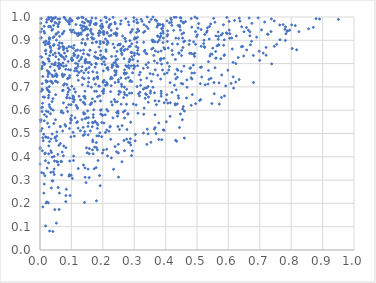
| Category | Series 0 |
|---|---|
| 0.4541369420824358 | 0.909 |
| 0.36425342668402716 | 0.811 |
| 0.018650621377337084 | 0.858 |
| 0.0783598240956136 | 0.818 |
| 0.2922729791080716 | 0.83 |
| 0.29078168796211856 | 0.79 |
| 0.0564504176763333 | 0.79 |
| 0.43031631814700655 | 0.755 |
| 0.1671409404880987 | 0.43 |
| 0.13271264775680214 | 0.827 |
| 0.040819704898491516 | 0.744 |
| 0.17581709795238964 | 0.552 |
| 0.312103027566468 | 0.587 |
| 0.1767316980024516 | 0.712 |
| 0.3323527349268639 | 0.852 |
| 0.16851155233598247 | 0.926 |
| 0.08935125592848436 | 0.695 |
| 0.4416318706145448 | 0.908 |
| 0.5812284132317448 | 0.929 |
| 0.33890889523830825 | 0.667 |
| 0.13967466178064936 | 0.76 |
| 0.07198768803036892 | 0.874 |
| 0.1455543402932431 | 0.819 |
| 0.21270084164136616 | 0.781 |
| 0.48914580625368986 | 0.893 |
| 0.4280387875943369 | 0.707 |
| 0.4047458006389789 | 0.918 |
| 0.17159628320159548 | 0.907 |
| 0.5756643256816426 | 0.821 |
| 0.19874253216855642 | 0.681 |
| 0.18305179460638032 | 0.658 |
| 0.24159906574446288 | 0.815 |
| 0.320402945626715 | 0.706 |
| 0.02074122131646161 | 0.978 |
| 0.5106205685438825 | 0.714 |
| 0.012143292039864306 | 0.891 |
| 0.0984474566373773 | 0.486 |
| 0.3447758604875678 | 0.634 |
| 0.33008943466359286 | 0.892 |
| 0.24533536410372947 | 0.852 |
| 0.06525715334072535 | 0.796 |
| 0.6151005348451926 | 0.743 |
| 0.19778845373506615 | 0.826 |
| 0.4149898250707045 | 0.632 |
| 0.27063028779467924 | 0.598 |
| 0.5353802198144602 | 0.712 |
| 0.2596065376764354 | 0.711 |
| 0.338888895276118 | 0.96 |
| 0.2910314465212448 | 0.937 |
| 0.6495799612318601 | 0.937 |
| 0.053574029154777825 | 0.489 |
| 0.3858724370550355 | 0.672 |
| 0.22816741107886374 | 0.831 |
| 0.02404067803977139 | 0.687 |
| 0.5053747462175968 | 0.972 |
| 0.23913396804368336 | 0.444 |
| 0.02721246293353108 | 0.998 |
| 0.5877486356801914 | 0.838 |
| 0.010044281454874238 | 0.657 |
| 0.11949237883693464 | 0.75 |
| 0.14152268942164326 | 0.974 |
| 0.12875278811770008 | 0.856 |
| 0.4836016601873022 | 0.759 |
| 0.21031053189299398 | 0.852 |
| 0.10618926136195761 | 0.866 |
| 0.041926912950980166 | 0.6 |
| 0.3598018179194665 | 1 |
| 0.10697274939400103 | 0.403 |
| 0.07803875219114242 | 0.845 |
| 0.9504997006804918 | 0.99 |
| 0.2882988565384922 | 0.728 |
| 0.37870212282139126 | 0.639 |
| 0.34010026515594827 | 0.842 |
| 0.061631539486543874 | 0.244 |
| 0.36233553358374215 | 0.835 |
| 0.03248012637427444 | 0.96 |
| 0.40574863017601126 | 0.803 |
| 0.21633209380656548 | 0.596 |
| 0.041054274983091 | 0.296 |
| 0.2816579293260615 | 0.741 |
| 0.6573896398284917 | 0.955 |
| 0.2938063175668243 | 0.426 |
| 0.06504099672238872 | 0.53 |
| 0.4069769954057041 | 0.63 |
| 0.3456985529301929 | 0.657 |
| 0.3760647000550975 | 0.971 |
| 0.08461552189911503 | 0.611 |
| 0.30965293640458824 | 0.843 |
| 0.05953342018716079 | 0.818 |
| 0.04476399357649252 | 0.401 |
| 0.013555992059082644 | 0.283 |
| 0.008874802842391283 | 0.806 |
| 0.41870071285473387 | 0.977 |
| 0.03466317690662324 | 0.333 |
| 0.10559863921114221 | 0.944 |
| 0.29167124145384915 | 0.405 |
| 0.22918592075789446 | 0.784 |
| 0.29889313872690504 | 0.779 |
| 0.022533577618071177 | 0.352 |
| 0.2747718021762249 | 0.759 |
| 0.48334845671236126 | 0.956 |
| 0.658199075217468 | 0.859 |
| 0.1634669312665974 | 0.698 |
| 0.006309790659640435 | 0.594 |
| 0.21064776395940066 | 0.997 |
| 0.47643352648004833 | 0.898 |
| 0.030837723719345567 | 0.614 |
| 0.3108227236191141 | 0.791 |
| 0.09386920524215847 | 0.687 |
| 0.44931941628924 | 0.983 |
| 0.2265695170696711 | 0.742 |
| 0.30889219868230056 | 0.975 |
| 0.09017447047753624 | 0.738 |
| 0.5331298404898002 | 0.954 |
| 0.2878046055647129 | 0.874 |
| 0.048170316949937564 | 0.484 |
| 0.4199437147608537 | 0.964 |
| 0.2662692950677372 | 0.654 |
| 0.14785019604814453 | 0.778 |
| 0.021013088155172555 | 0.572 |
| 0.7378631466656779 | 0.799 |
| 0.4100560462313191 | 0.772 |
| 0.0064508919697394695 | 0.521 |
| 0.03780236720581054 | 0.752 |
| 0.49498769861988523 | 0.937 |
| 0.21351042747723104 | 0.933 |
| 0.1852764950040745 | 0.823 |
| 0.07128248717239882 | 0.684 |
| 0.2856888214332125 | 0.819 |
| 0.20124431171284518 | 0.892 |
| 0.5609053205826052 | 0.824 |
| 0.005864190248920376 | 0.777 |
| 0.04195475197498022 | 0.995 |
| 0.09855438923607851 | 0.559 |
| 0.1873865830798579 | 0.704 |
| 0.27476107753262824 | 0.759 |
| 0.47641725049767003 | 0.844 |
| 0.36570761163544907 | 0.893 |
| 0.19330847875349755 | 0.583 |
| 0.6795224545742741 | 0.835 |
| 0.36686570917647154 | 0.988 |
| 0.6195148735880477 | 0.985 |
| 0.5244956043004907 | 0.869 |
| 0.007142698141979542 | 0.789 |
| 0.3763161766747162 | 0.85 |
| 0.1340034894601132 | 0.56 |
| 0.08737119556738138 | 0.854 |
| 0.2769282734567643 | 0.517 |
| 0.035990338885753204 | 0.266 |
| 0.37522888927185294 | 0.75 |
| 0.20350148362140397 | 0.827 |
| 0.04619843017007885 | 0.382 |
| 0.15406376569205482 | 0.762 |
| 0.02948032620979113 | 0.624 |
| 0.1326431372923622 | 0.952 |
| 0.1178596067890968 | 0.768 |
| 0.08625787822178443 | 0.655 |
| 0.4543546195508078 | 0.605 |
| 0.022018005345493585 | 0.989 |
| 0.5222895041005955 | 0.9 |
| 0.05080203431535568 | 0.926 |
| 0.09958617028012962 | 0.872 |
| 0.21236578380501003 | 0.432 |
| 0.05988980113013698 | 0.864 |
| 0.20851976980650921 | 0.504 |
| 0.07291981450836904 | 0.744 |
| 0.12440270616456861 | 0.66 |
| 0.09407203263259745 | 0.522 |
| 0.016730558132901474 | 0.416 |
| 0.7891567653962412 | 0.941 |
| 0.38590304090034067 | 0.66 |
| 0.1757211668190759 | 0.785 |
| 0.15223784389804185 | 0.982 |
| 0.4573507729525591 | 0.893 |
| 0.07437989823760793 | 0.404 |
| 0.19626025132430736 | 0.951 |
| 0.6947015937454893 | 0.996 |
| 0.3924862760429998 | 0.93 |
| 0.1682930876194415 | 0.765 |
| 0.10069007765472104 | 0.935 |
| 0.11927570289868539 | 0.858 |
| 0.3542473766692976 | 0.989 |
| 0.17928708943364713 | 0.461 |
| 0.1386232545259607 | 0.858 |
| 0.2841207225004484 | 0.781 |
| 0.19148609066653544 | 0.895 |
| 0.14547053902998863 | 0.948 |
| 0.15645238797563166 | 0.783 |
| 0.0032120869314473666 | 0.559 |
| 0.19678771957608887 | 0.547 |
| 0.008023046146383828 | 0.613 |
| 0.27297736309575293 | 0.993 |
| 0.37465888955938476 | 0.963 |
| 0.052160412941622436 | 0.115 |
| 0.11594989284964985 | 0.779 |
| 0.18921667651226115 | 0.941 |
| 0.17400647309308148 | 0.442 |
| 0.27093188311072924 | 0.86 |
| 0.314580168422531 | 0.839 |
| 0.35572084222226785 | 0.862 |
| 0.2266560334695189 | 0.705 |
| 0.2785425363933538 | 0.862 |
| 0.15828190726365565 | 0.805 |
| 0.24555157704604225 | 0.928 |
| 0.18124772811408185 | 0.824 |
| 0.1402829389296153 | 0.959 |
| 0.3828031824474749 | 0.967 |
| 0.5084833638727518 | 0.642 |
| 0.298863736464977 | 0.981 |
| 0.1374592727310029 | 0.492 |
| 0.28605483769843765 | 0.724 |
| 0.07673287446554033 | 0.998 |
| 0.21427684112351064 | 0.93 |
| 0.263068972043478 | 0.918 |
| 0.23267286121770692 | 0.792 |
| 0.2437506743206974 | 0.794 |
| 0.20355799827646714 | 0.89 |
| 0.3924943648783217 | 0.516 |
| 0.4425999580263531 | 0.844 |
| 0.0160308854770842 | 0.891 |
| 0.1566524486322406 | 0.311 |
| 0.04805916400474797 | 0.977 |
| 0.4084849959154375 | 0.867 |
| 0.08208455198885678 | 0.776 |
| 0.1994325435088875 | 0.96 |
| 0.5115993150903224 | 0.645 |
| 0.1870255614022176 | 0.49 |
| 0.6996893600300669 | 0.814 |
| 0.014444229824094879 | 0.8 |
| 0.5842408924470461 | 0.967 |
| 0.23781993275759594 | 0.769 |
| 0.25833157483873515 | 0.626 |
| 0.005581173460848632 | 0.827 |
| 0.0025225022676823583 | 0.973 |
| 0.021957989079289142 | 0.207 |
| 0.17786720903841025 | 0.826 |
| 0.27012285293958294 | 0.667 |
| 0.11975884592345376 | 0.608 |
| 0.10085551412692129 | 0.824 |
| 0.035564394351208506 | 0.983 |
| 0.026941532281781422 | 0.653 |
| 0.3076736115152706 | 0.989 |
| 0.35058381226790647 | 0.757 |
| 0.2366543735405674 | 0.868 |
| 0.13488703056549411 | 0.71 |
| 0.2391203070301079 | 0.719 |
| 0.05143804546716024 | 0.756 |
| 0.05230381503651105 | 0.929 |
| 0.456293890866143 | 0.978 |
| 0.7635413414886403 | 0.966 |
| 0.12426406054115047 | 0.762 |
| 0.2925383067668079 | 0.847 |
| 0.3912119711789612 | 0.94 |
| 0.05686343421882234 | 0.41 |
| 0.3451500046406737 | 0.805 |
| 0.3531314611141104 | 0.462 |
| 0.5472236785643281 | 0.629 |
| 0.04547044501751352 | 0.995 |
| 0.03558558279790902 | 0.856 |
| 0.13590593925974037 | 0.904 |
| 0.5868532986971456 | 0.902 |
| 0.24992347943655913 | 0.721 |
| 0.07100690508364638 | 0.751 |
| 0.7459459503546911 | 0.983 |
| 0.1406654270866099 | 0.735 |
| 0.0041274205002707065 | 0.911 |
| 0.38708877336909175 | 0.95 |
| 0.42224443377735366 | 0.838 |
| 0.28493127984924504 | 0.673 |
| 0.042661418663393125 | 0.335 |
| 0.38228024089360724 | 0.912 |
| 0.03218664254881376 | 0.874 |
| 0.014106705722624513 | 0.796 |
| 0.20788287112621306 | 0.707 |
| 0.3601573909733856 | 0.866 |
| 0.16239279874317214 | 0.626 |
| 0.06661348776829601 | 0.38 |
| 0.6252458509119221 | 0.919 |
| 0.550305730563669 | 0.866 |
| 0.47481830790754265 | 0.882 |
| 0.18274946764879674 | 0.43 |
| 0.22618609440134707 | 0.921 |
| 0.2203915097200836 | 0.919 |
| 0.27606459424872876 | 0.69 |
| 0.3859895735717822 | 0.681 |
| 0.10474518238222752 | 0.661 |
| 0.6312983460024706 | 0.826 |
| 0.1799770211432986 | 0.681 |
| 0.5778465238225861 | 0.655 |
| 0.8903285603433714 | 0.991 |
| 0.27046773434369276 | 0.907 |
| 0.0752775642186646 | 0.789 |
| 0.3317349462892235 | 0.609 |
| 0.879320463662286 | 0.993 |
| 0.20692922952487836 | 0.795 |
| 0.1960451943589986 | 0.82 |
| 0.7369867485885088 | 0.992 |
| 0.09131200103866388 | 0.624 |
| 0.4381684085985752 | 0.884 |
| 0.3713550971561367 | 0.983 |
| 0.1517132422580998 | 0.84 |
| 0.25081253213517485 | 0.668 |
| 0.21705047319015247 | 0.89 |
| 0.35984314740880297 | 0.699 |
| 0.5400260520649498 | 0.959 |
| 0.09911167641923757 | 0.624 |
| 0.5673275378557852 | 0.936 |
| 0.004518001135453087 | 0.333 |
| 0.13660763118459218 | 0.942 |
| 0.06771625411933613 | 0.591 |
| 0.03893814798851403 | 0.498 |
| 0.07409946580578852 | 0.827 |
| 0.1290811102637308 | 0.644 |
| 0.22714021728704636 | 0.395 |
| 0.1435398005625227 | 0.625 |
| 0.23229198455824418 | 0.567 |
| 0.4812495596317009 | 0.739 |
| 0.07119324898024681 | 0.755 |
| 0.16707173664101738 | 0.547 |
| 0.09230762674773918 | 0.873 |
| 0.824483518822307 | 0.937 |
| 0.15379207247973592 | 0.546 |
| 0.40371479511626385 | 0.667 |
| 0.7153551899293966 | 0.979 |
| 0.053718865951095096 | 0.507 |
| 0.15895442903281354 | 0.857 |
| 0.022020907744467744 | 0.695 |
| 0.451892852006339 | 0.927 |
| 0.2692555759861881 | 0.773 |
| 0.14729539204288666 | 0.957 |
| 0.4048350967616672 | 0.983 |
| 0.24377426401760005 | 0.421 |
| 0.1418899512159617 | 0.496 |
| 0.2888481577960631 | 0.548 |
| 0.1062843021161074 | 0.636 |
| 0.13866160802781713 | 0.365 |
| 0.4510432962238673 | 0.857 |
| 0.4929036812728268 | 0.844 |
| 0.5863236046014392 | 0.835 |
| 0.2692725224097928 | 0.426 |
| 0.0009012599493637419 | 0.559 |
| 0.35152030428232095 | 0.673 |
| 0.06429296179803667 | 0.837 |
| 0.10880191547643758 | 0.691 |
| 0.15711970573058398 | 0.435 |
| 0.38063379023419697 | 0.968 |
| 0.029385395652704704 | 0.81 |
| 0.01467546290095556 | 0.931 |
| 0.009208111474032332 | 0.185 |
| 0.16402166484103697 | 0.632 |
| 0.4183018471177953 | 0.988 |
| 0.6699044855570072 | 0.881 |
| 0.12832661812426782 | 0.512 |
| 0.0018386345794234593 | 0.551 |
| 0.21185688861142538 | 0.719 |
| 0.36431758229583056 | 0.519 |
| 0.05619172535897954 | 0.72 |
| 0.05096616665646836 | 0.974 |
| 0.13755465031697656 | 0.634 |
| 0.13382387808285212 | 0.787 |
| 0.3927003302440223 | 0.962 |
| 0.22509495974661298 | 0.475 |
| 0.1625564574436652 | 0.947 |
| 0.5711089862480093 | 0.626 |
| 0.31676529040930845 | 0.661 |
| 0.21240693655361476 | 0.603 |
| 0.36623982384717213 | 0.64 |
| 0.6041729605271365 | 0.909 |
| 0.0952891818203726 | 0.99 |
| 0.26526275080066186 | 0.873 |
| 0.03528656856085943 | 0.606 |
| 0.14212522855511467 | 0.944 |
| 0.15919379545918733 | 0.858 |
| 0.4957744903448973 | 0.628 |
| 0.6660875225642539 | 0.995 |
| 0.07930449076346857 | 0.538 |
| 0.32942163254018875 | 0.502 |
| 0.2877231899134127 | 0.477 |
| 0.1928523321174056 | 0.934 |
| 0.07574103472587379 | 0.865 |
| 0.25913873421279177 | 0.864 |
| 0.3018524874217119 | 0.788 |
| 0.207676688589584 | 0.58 |
| 0.03706948099942786 | 0.982 |
| 0.2683847411883101 | 0.856 |
| 0.21398201359004554 | 0.897 |
| 0.2484633212147248 | 0.596 |
| 0.31377649977939714 | 0.671 |
| 0.3523210706761435 | 0.683 |
| 0.5304973462744679 | 0.934 |
| 0.21430487793522623 | 0.713 |
| 0.22102704752036273 | 0.99 |
| 0.17369729460615635 | 0.83 |
| 0.8013167119314735 | 0.966 |
| 0.11162366489998721 | 0.567 |
| 0.5131291955663926 | 0.874 |
| 0.04530477107554709 | 0.324 |
| 0.17971267555023684 | 0.211 |
| 0.14642270470940744 | 0.99 |
| 0.01701623981648548 | 0.881 |
| 0.23019448652694485 | 0.737 |
| 0.6346659136535345 | 0.995 |
| 0.20256745975128265 | 0.682 |
| 0.43909576096113334 | 0.771 |
| 0.4124409002251608 | 0.975 |
| 0.4471038274520973 | 0.944 |
| 0.5594605754506322 | 0.852 |
| 0.050100118465722376 | 0.667 |
| 0.2902282668474312 | 0.848 |
| 0.679905216772546 | 0.719 |
| 0.4683259825086038 | 0.698 |
| 0.4612034325875367 | 0.897 |
| 0.28926709112482696 | 0.45 |
| 0.2673579485695796 | 0.47 |
| 0.15265360764571734 | 0.924 |
| 0.09054160081297014 | 0.98 |
| 0.17761542654068518 | 0.801 |
| 0.04927730747789094 | 0.559 |
| 0.09659719678827106 | 0.944 |
| 0.028148532874815557 | 0.816 |
| 0.03279631513297954 | 0.786 |
| 0.04787764489321833 | 0.795 |
| 0.2614679800333719 | 0.534 |
| 0.044116253854094345 | 0.543 |
| 0.07448016381318745 | 0.631 |
| 0.12439128797016796 | 0.812 |
| 0.1440561553373243 | 0.564 |
| 0.735782527601589 | 0.938 |
| 0.36971941786720053 | 0.5 |
| 0.17879163211934035 | 0.892 |
| 0.18984760079033935 | 0.662 |
| 0.28311726351828714 | 0.808 |
| 0.04865417509895009 | 0.804 |
| 0.189079876769784 | 0.703 |
| 0.30077369882814786 | 0.844 |
| 0.027005960446796817 | 0.684 |
| 0.17944576086869934 | 0.798 |
| 0.3377211672265933 | 0.795 |
| 0.2481247621716094 | 0.879 |
| 0.01220156935590655 | 0.244 |
| 0.06237940405996045 | 0.889 |
| 0.0998430640140594 | 0.557 |
| 0.17238401886317656 | 0.737 |
| 0.4403030898950866 | 0.662 |
| 0.13887363494795946 | 0.59 |
| 0.10036088977758661 | 0.818 |
| 0.1566236881550288 | 0.413 |
| 0.24046047793709013 | 0.805 |
| 0.43197226969580127 | 0.471 |
| 0.39545445468512763 | 0.632 |
| 0.008077410871472734 | 0.687 |
| 0.6028229935105965 | 0.944 |
| 0.12289738019293162 | 0.996 |
| 0.13037121620364156 | 0.819 |
| 0.02351308132388774 | 0.77 |
| 0.24124218008797482 | 0.753 |
| 0.4585831106969598 | 0.789 |
| 0.6898770026255221 | 0.914 |
| 0.5444608111215273 | 0.737 |
| 0.2572558624716339 | 0.738 |
| 0.2247452820538165 | 0.734 |
| 0.33041280981972554 | 0.583 |
| 0.3645760540895764 | 0.675 |
| 0.19897126199944637 | 0.578 |
| 0.20101676778127708 | 0.723 |
| 0.018922364077915255 | 0.897 |
| 0.01792931092836647 | 0.103 |
| 0.13716027592787672 | 0.997 |
| 0.6737108208893431 | 0.896 |
| 0.16057308205293042 | 0.974 |
| 0.10844782677085207 | 0.878 |
| 0.050461913759274 | 0.83 |
| 0.08533335614641602 | 0.653 |
| 0.3108183939730301 | 0.857 |
| 0.027196943741253365 | 0.374 |
| 0.08327423030436132 | 0.791 |
| 0.11926242701816092 | 0.995 |
| 0.0007382035579216462 | 0.44 |
| 0.45636475354710204 | 0.615 |
| 0.1533947554948446 | 0.494 |
| 0.4490389709195898 | 0.995 |
| 0.2608257668381778 | 0.839 |
| 0.5959231868641973 | 0.929 |
| 0.1949553400667995 | 0.602 |
| 0.25011217825207654 | 0.313 |
| 0.32921141132058507 | 0.78 |
| 0.48398902053016857 | 0.734 |
| 0.41432989164959944 | 0.718 |
| 0.12070768713296454 | 0.92 |
| 0.11279526753267888 | 0.678 |
| 0.2919774966827401 | 0.723 |
| 0.2367053044030767 | 0.646 |
| 0.40490047447571964 | 0.76 |
| 0.334836376046698 | 0.651 |
| 0.27608084724984794 | 0.476 |
| 0.210207096795489 | 0.859 |
| 0.2973089199771375 | 0.626 |
| 0.5130297600727377 | 0.946 |
| 0.2602453049561617 | 0.844 |
| 0.4952862429077425 | 0.883 |
| 0.7201242796081747 | 0.836 |
| 0.3907168427634776 | 0.968 |
| 0.5212247494454673 | 0.886 |
| 0.45988756774766804 | 0.48 |
| 0.019080305225999017 | 0.202 |
| 0.19639197184129176 | 0.486 |
| 0.24460891183548494 | 0.788 |
| 0.023796680431111827 | 0.723 |
| 0.15187929120801458 | 0.597 |
| 0.2132741187894136 | 0.708 |
| 0.24957498165744307 | 0.731 |
| 0.16525891645607227 | 0.996 |
| 0.32953247980371125 | 0.934 |
| 0.08217455777303462 | 0.208 |
| 0.3146382566323549 | 0.939 |
| 0.005444872218579588 | 0.949 |
| 0.0042491328696004915 | 0.611 |
| 0.14770500155141653 | 0.439 |
| 0.22374784052812713 | 0.531 |
| 0.698187668362207 | 0.853 |
| 0.5676312539209056 | 0.905 |
| 0.2495873668832136 | 0.416 |
| 0.3432079729539208 | 0.783 |
| 0.30642101149726064 | 0.873 |
| 0.057815168728858946 | 0.268 |
| 0.19163350171631943 | 0.276 |
| 0.552916205769409 | 0.994 |
| 0.3061732590560289 | 0.623 |
| 0.22232582472656504 | 0.967 |
| 0.6368096695976116 | 0.982 |
| 0.20173439656057468 | 0.769 |
| 0.10430936059541607 | 0.65 |
| 0.14586203225028826 | 0.772 |
| 0.258005918173134 | 0.855 |
| 0.3031268956443739 | 0.469 |
| 0.07404616431889277 | 0.686 |
| 0.3782265902359506 | 0.474 |
| 0.15304024462562393 | 0.347 |
| 0.06009609668178584 | 0.845 |
| 0.17803214374087495 | 0.967 |
| 0.038603989291271956 | 0.637 |
| 0.20340166086063427 | 0.925 |
| 0.10183111827447555 | 0.813 |
| 0.15313815106527895 | 0.704 |
| 0.2484788331037836 | 0.787 |
| 0.11053911675856076 | 0.933 |
| 0.17693004138567703 | 0.849 |
| 0.1426112738157428 | 0.658 |
| 0.5224785245125364 | 0.873 |
| 0.1053546593060507 | 0.505 |
| 0.36086363235217644 | 0.9 |
| 0.026297434917503915 | 0.885 |
| 0.13099564409693176 | 0.926 |
| 0.584923768403753 | 0.879 |
| 0.19249487962217826 | 0.64 |
| 0.12038539855552133 | 0.799 |
| 0.3707886148593895 | 0.624 |
| 0.36018681889157367 | 0.754 |
| 0.1897100434238339 | 0.319 |
| 0.14858557529721006 | 0.567 |
| 0.048838065741071635 | 0.725 |
| 0.420408047681759 | 0.856 |
| 0.08248632147183399 | 0.234 |
| 0.7533662863670872 | 0.883 |
| 0.7109917569127754 | 0.845 |
| 0.8130961735377236 | 0.963 |
| 0.14330415175493882 | 0.682 |
| 0.026581251113477644 | 0.755 |
| 0.3850885327055641 | 0.918 |
| 0.04454936973590573 | 0.882 |
| 0.2545417326302357 | 0.881 |
| 0.2733752985702862 | 0.791 |
| 0.16971691306865144 | 0.569 |
| 0.151379843090916 | 0.906 |
| 0.0703497670792882 | 0.888 |
| 0.044793451102708826 | 0.915 |
| 0.04701975573670936 | 0.173 |
| 0.025082036164416066 | 0.744 |
| 0.5542631594911178 | 0.719 |
| 0.17492872532978643 | 0.638 |
| 0.334242529780709 | 0.696 |
| 0.498435621487753 | 0.916 |
| 0.23441412718604715 | 0.346 |
| 0.13493578908855008 | 0.979 |
| 0.22282315527332686 | 0.528 |
| 0.03550021295037664 | 0.998 |
| 0.0025260944582348177 | 0.511 |
| 0.011836622963806276 | 0.497 |
| 0.02767068573225928 | 0.663 |
| 0.1850125751136238 | 0.384 |
| 0.38373855839798965 | 0.82 |
| 0.1548157394692985 | 0.738 |
| 0.367171469647417 | 0.773 |
| 0.3747426516285325 | 0.892 |
| 0.3092191279085845 | 0.701 |
| 0.34425096435870384 | 0.498 |
| 0.21326194827306044 | 0.882 |
| 0.07229161482240631 | 0.511 |
| 0.31194728577912556 | 0.868 |
| 0.3672261011505846 | 0.854 |
| 0.18806363043799668 | 0.871 |
| 0.6150532362825896 | 0.805 |
| 0.6636966084476235 | 0.943 |
| 0.06251593357590868 | 0.917 |
| 0.014258281196131928 | 0.581 |
| 0.14262669504614822 | 0.585 |
| 0.0976129783716515 | 0.564 |
| 0.020895358127596353 | 0.72 |
| 0.14329366597296023 | 0.352 |
| 0.18450700558024358 | 0.822 |
| 0.07549347308150989 | 0.446 |
| 0.6685562831407119 | 0.936 |
| 0.23838897060535025 | 0.977 |
| 0.012632076690681782 | 0.939 |
| 0.03362600932607851 | 0.724 |
| 0.1317428395324597 | 0.769 |
| 0.28155120598922767 | 0.462 |
| 0.6165036115911371 | 0.695 |
| 0.2022707784560237 | 0.673 |
| 0.2797807147367505 | 0.583 |
| 0.23992206173896036 | 0.636 |
| 0.3963034520751023 | 0.755 |
| 0.3846002315938104 | 0.929 |
| 0.057086781345977555 | 0.991 |
| 0.38370982389766695 | 0.815 |
| 0.8705193241879561 | 0.956 |
| 0.20321349020196822 | 0.69 |
| 0.003165245754646162 | 0.681 |
| 0.05200511236030181 | 0.469 |
| 0.04107192634120249 | 0.08 |
| 0.2454420701199418 | 0.95 |
| 0.07272096477946799 | 0.931 |
| 0.41192175644884743 | 0.788 |
| 0.3112655610503582 | 0.81 |
| 0.17286900411948014 | 0.349 |
| 0.2041853721287632 | 0.728 |
| 0.2883882353065138 | 0.933 |
| 0.23838611639777219 | 0.75 |
| 0.2691351608785011 | 0.567 |
| 0.08265290744019593 | 0.439 |
| 0.05251109642600871 | 0.901 |
| 0.04183617734977296 | 0.912 |
| 0.645431601304502 | 0.874 |
| 0.7054743338869268 | 0.945 |
| 0.09222396177976966 | 0.317 |
| 0.14646786047463267 | 0.289 |
| 0.15463069009399777 | 0.72 |
| 0.08539342366801494 | 0.71 |
| 0.03857909021318162 | 0.297 |
| 0.45509046892739724 | 0.869 |
| 0.06477566679933311 | 0.457 |
| 0.030760725400337807 | 0.834 |
| 0.5011274529354494 | 0.923 |
| 0.16096411647997733 | 0.941 |
| 0.05619416302554392 | 0.378 |
| 0.08791025419422915 | 0.594 |
| 0.34425920503459273 | 0.95 |
| 0.366499699503834 | 0.525 |
| 0.5365445547085474 | 0.771 |
| 0.09370858865919673 | 0.323 |
| 0.044944390610252016 | 0.348 |
| 0.12290956996376101 | 0.931 |
| 0.1816445565532594 | 0.742 |
| 0.19914266387182522 | 0.958 |
| 0.2736078660026059 | 0.736 |
| 0.025772338416968132 | 0.482 |
| 0.06319605124668937 | 0.869 |
| 0.33789172613770746 | 0.843 |
| 0.4314465851041661 | 0.623 |
| 0.3842409430230662 | 0.734 |
| 0.007490403211824037 | 0.426 |
| 0.3131204211590709 | 0.943 |
| 0.5690979499078639 | 0.88 |
| 0.4918590114841749 | 0.76 |
| 0.6422900689268926 | 0.958 |
| 0.06108463292173971 | 0.779 |
| 0.5766394895769702 | 0.922 |
| 0.3251543883865522 | 0.982 |
| 0.0432435255438226 | 0.964 |
| 0.08492602933556526 | 0.866 |
| 0.03018346367457403 | 0.465 |
| 0.16930619137810254 | 0.413 |
| 0.09332566658542141 | 0.975 |
| 0.18394561719435432 | 0.537 |
| 0.19733744346225335 | 0.798 |
| 0.13538552442044882 | 0.74 |
| 0.4202202380247966 | 0.677 |
| 0.06465270389071165 | 0.53 |
| 0.3599591799705948 | 0.893 |
| 0.319292603101311 | 0.763 |
| 0.5434968965064805 | 0.841 |
| 0.35705040295453194 | 0.901 |
| 0.18267083809523332 | 0.522 |
| 0.593527768273181 | 0.932 |
| 0.4323954140365631 | 0.735 |
| 0.764351179355516 | 0.902 |
| 0.641325550432646 | 0.872 |
| 0.07087499230297423 | 0.927 |
| 0.47961838201597073 | 0.782 |
| 0.011586803405995716 | 0.329 |
| 0.5574594407566946 | 0.782 |
| 0.27532367468883734 | 0.626 |
| 0.19691597142839146 | 0.97 |
| 0.13955040750857206 | 0.584 |
| 0.24249155240047326 | 0.927 |
| 0.1750237576693222 | 0.55 |
| 0.07815444880445643 | 0.714 |
| 0.43269564869893695 | 0.909 |
| 0.15170298182661135 | 0.949 |
| 0.11335265233109615 | 0.855 |
| 0.11432908466198688 | 0.968 |
| 0.18320672768686364 | 0.744 |
| 0.569046965945133 | 0.881 |
| 0.028148436189117443 | 0.447 |
| 0.09938841777187213 | 0.984 |
| 0.4145232636886089 | 0.574 |
| 0.16859169189650558 | 0.545 |
| 0.18650235817433092 | 0.93 |
| 0.15287734752384352 | 0.53 |
| 0.674800349277983 | 0.973 |
| 0.13840455056198875 | 0.842 |
| 0.26022532708649704 | 0.702 |
| 0.019274126864912478 | 0.727 |
| 0.3734130381635994 | 0.802 |
| 0.24611463288350344 | 0.637 |
| 0.2818751610636159 | 0.792 |
| 0.4304838153747671 | 0.628 |
| 0.02595981056564678 | 0.821 |
| 0.3002851739921131 | 0.906 |
| 0.34135130345117504 | 1 |
| 0.3208960732720716 | 0.73 |
| 0.0037813429925231956 | 0.993 |
| 0.09931431032229043 | 0.321 |
| 0.16955980463537423 | 0.581 |
| 0.05747332209316469 | 0.959 |
| 0.002096692289355828 | 0.936 |
| 0.47767142057375644 | 0.78 |
| 0.4472934763041092 | 0.583 |
| 0.1505697775457301 | 0.417 |
| 0.10955574724793271 | 0.489 |
| 0.1640375681036409 | 0.93 |
| 0.25305432814286377 | 0.517 |
| 0.2810619173632496 | 0.979 |
| 0.35488494064204634 | 0.724 |
| 0.40691607408410846 | 0.924 |
| 0.24820966294421654 | 0.53 |
| 0.5482526178745332 | 0.84 |
| 0.2261345191342229 | 0.97 |
| 0.22675516573767207 | 0.943 |
| 0.033412658771347026 | 0.849 |
| 0.13291662272880944 | 0.999 |
| 0.14445616875173273 | 0.803 |
| 0.3185893259461703 | 0.678 |
| 0.09473938584891473 | 0.749 |
| 0.5364114073504931 | 0.809 |
| 0.39300264670415164 | 0.91 |
| 0.18153309859555233 | 0.761 |
| 0.48214601002139634 | 0.843 |
| 0.10660391152276638 | 0.384 |
| 0.04807020357445135 | 0.48 |
| 0.1443537690752701 | 0.881 |
| 0.15515645546003387 | 0.98 |
| 0.5916525640379622 | 0.704 |
| 0.5572350446356422 | 0.978 |
| 0.10416310813095386 | 0.816 |
| 0.2830051833565741 | 0.966 |
| 0.3108175362410418 | 0.948 |
| 0.25543577536785855 | 0.885 |
| 0.03842482392635682 | 0.798 |
| 0.24157365264345543 | 0.932 |
| 0.7832249634776997 | 0.928 |
| 0.017397583518270254 | 0.383 |
| 0.14347742599305147 | 0.807 |
| 0.23019467276104355 | 0.623 |
| 0.13613467466556484 | 0.962 |
| 0.016983998997436967 | 0.855 |
| 0.4214019162773015 | 0.884 |
| 0.24381351496376702 | 0.59 |
| 0.39750578366610057 | 0.862 |
| 0.1619381819723309 | 0.984 |
| 0.16013943773297523 | 0.511 |
| 0.06334094511109534 | 0.992 |
| 0.29495959631815505 | 0.76 |
| 0.10141027518720147 | 0.703 |
| 0.45978731055899147 | 0.596 |
| 0.12191630225821071 | 0.35 |
| 0.06325056224640813 | 0.781 |
| 0.29858922913809827 | 0.997 |
| 0.1665788491185488 | 0.889 |
| 0.19884763832316565 | 0.578 |
| 0.1167023434936022 | 0.546 |
| 0.21589669832831127 | 0.783 |
| 0.5950208556596408 | 0.998 |
| 0.026510703151252035 | 0.202 |
| 0.030053110725654197 | 0.678 |
| 0.3006546923688903 | 0.835 |
| 0.09461410540075066 | 0.382 |
| 0.13100427651028945 | 0.932 |
| 0.1194643252878802 | 0.551 |
| 0.10756981447953373 | 0.833 |
| 0.17391791770062226 | 0.681 |
| 0.5245869432341286 | 0.925 |
| 0.09679339072627335 | 0.773 |
| 0.15279299695984172 | 0.804 |
| 0.19077717519938642 | 0.503 |
| 0.2684855730789394 | 0.76 |
| 0.7817320016266904 | 0.958 |
| 0.610567826989257 | 0.91 |
| 0.21501831165550123 | 0.404 |
| 0.08204460100907751 | 0.531 |
| 0.37460648714130174 | 0.919 |
| 0.6085919719287447 | 0.715 |
| 0.5983269678724374 | 0.771 |
| 0.30580731826118224 | 0.908 |
| 0.11835154297083172 | 0.826 |
| 0.008204657515695879 | 0.63 |
| 0.8555706236244868 | 0.949 |
| 0.2514755467463341 | 0.681 |
| 0.4162467951085801 | 0.995 |
| 0.6235875090605045 | 0.721 |
| 0.039466863122546325 | 0.988 |
| 0.07452775285143654 | 0.86 |
| 0.3660258397870684 | 0.58 |
| 0.20910154941319758 | 0.822 |
| 0.027470767720643163 | 0.413 |
| 0.006976813302195017 | 0.714 |
| 0.5001726641174791 | 0.995 |
| 0.048512455833848334 | 0.845 |
| 0.06881447239339811 | 0.379 |
| 0.08960429515032442 | 0.809 |
| 0.25652488870723034 | 0.97 |
| 0.3783304963452836 | 0.545 |
| 0.08772722956866807 | 0.735 |
| 0.030641454515112243 | 0.081 |
| 0.45018110233277275 | 0.715 |
| 0.09459360266319206 | 0.652 |
| 0.402343440977746 | 0.644 |
| 0.3417080951516326 | 0.518 |
| 0.20257107637829586 | 0.93 |
| 0.24276137939697506 | 0.768 |
| 0.4923192804164219 | 0.831 |
| 0.4273580187176993 | 0.999 |
| 0.40235655897883293 | 0.55 |
| 0.6238261789950065 | 0.8 |
| 0.09577113780712154 | 0.234 |
| 0.39516172120178616 | 0.514 |
| 0.3444048353100687 | 0.702 |
| 0.1108306710583592 | 0.836 |
| 0.4577776300578493 | 0.932 |
| 0.058630169758025596 | 0.935 |
| 0.4064518200545907 | 0.94 |
| 0.14367065928197376 | 0.651 |
| 0.10313816298358913 | 0.308 |
| 0.20345671747467153 | 0.937 |
| 0.2943630259885047 | 0.947 |
| 0.028157108710698542 | 0.991 |
| 0.4572131051510172 | 0.974 |
| 0.7247530387127653 | 0.927 |
| 0.22471753066858347 | 0.68 |
| 0.28687368727672447 | 0.814 |
| 0.16649469795400063 | 0.529 |
| 0.0895524219461018 | 0.678 |
| 0.1877723879128863 | 0.921 |
| 0.12212464798830802 | 0.728 |
| 0.2919680970648513 | 0.674 |
| 0.06767623773794962 | 0.793 |
| 0.4884682067813345 | 0.794 |
| 0.013626306518083275 | 0.96 |
| 0.431469532519425 | 0.818 |
| 0.04693855991158735 | 0.747 |
| 0.033781907433216074 | 0.958 |
| 0.09550879069280105 | 0.32 |
| 0.33405835128360717 | 0.857 |
| 0.2469775396467574 | 0.574 |
| 0.24343607961475244 | 0.92 |
| 0.2569855323390351 | 0.861 |
| 0.1596748665305734 | 0.624 |
| 0.726426101350348 | 0.925 |
| 0.1917850802224128 | 0.885 |
| 0.31067564332862807 | 0.913 |
| 0.8174706766109748 | 0.859 |
| 0.07787130187750768 | 0.998 |
| 0.04010581142836345 | 0.948 |
| 0.5786319397676738 | 0.751 |
| 0.64862432494064 | 0.833 |
| 0.02956853265904491 | 0.911 |
| 0.03709651075827258 | 0.723 |
| 0.09416021038458511 | 0.739 |
| 0.8030864304448101 | 0.865 |
| 0.11838227145110392 | 0.612 |
| 0.17899727431037793 | 0.972 |
| 0.11326556257271803 | 0.802 |
| 0.3037903191750734 | 0.496 |
| 0.34834843966274953 | 0.979 |
| 0.3363395371681406 | 0.671 |
| 0.0831140367265002 | 0.831 |
| 0.17311131931106227 | 0.97 |
| 0.24941345997164144 | 0.453 |
| 0.02618099252066164 | 0.593 |
| 0.10982323763982715 | 0.769 |
| 0.273270385046792 | 0.895 |
| 0.09568483933506144 | 0.994 |
| 0.2678986816075224 | 0.821 |
| 0.5038176003027364 | 0.953 |
| 0.051238961320947185 | 0.724 |
| 0.4635286864377769 | 0.981 |
| 0.44436579771540696 | 0.964 |
| 0.5700129245573397 | 0.717 |
| 0.43993885795267174 | 0.963 |
| 0.1923434165873068 | 0.961 |
| 0.03854903993644432 | 0.399 |
| 0.1075453035928885 | 0.843 |
| 0.07060570188237503 | 0.42 |
| 0.2009558511206797 | 0.937 |
| 0.39464818955309056 | 0.868 |
| 0.34023756770827496 | 0.738 |
| 0.6046308985862084 | 0.929 |
| 0.008808115989274001 | 0.745 |
| 0.5686562452520739 | 0.917 |
| 0.2988642581989106 | 0.792 |
| 0.07297040766102803 | 0.803 |
| 0.31148646181855055 | 0.976 |
| 0.5550199096547377 | 0.67 |
| 0.4056525371948564 | 0.895 |
| 0.015656362005751823 | 0.413 |
| 0.5262226206882402 | 0.709 |
| 0.4502326050153239 | 0.766 |
| 0.0689560137293419 | 0.831 |
| 0.06865344683940056 | 0.597 |
| 0.01842778511174792 | 0.486 |
| 0.13286607122998784 | 0.889 |
| 0.20372647253415954 | 0.545 |
| 0.38683828085596195 | 0.821 |
| 0.00199691173836003 | 0.909 |
| 0.20130010235358986 | 0.719 |
| 0.05812622997043282 | 0.969 |
| 0.14257730190581375 | 0.508 |
| 0.24170822267914793 | 0.762 |
| 0.05964409633057344 | 0.791 |
| 0.30266140944494224 | 0.911 |
| 0.26095879988493675 | 0.379 |
| 0.07375128334141756 | 0.588 |
| 0.18145891958799865 | 0.544 |
| 0.06028765048686058 | 0.449 |
| 0.48499982654739726 | 0.667 |
| 0.1714068246420195 | 0.602 |
| 0.12201653621935937 | 0.834 |
| 0.08393657425535339 | 0.261 |
| 0.4667346235393608 | 0.652 |
| 0.04290854723991944 | 0.877 |
| 0.5599768679664068 | 0.823 |
| 0.39027108695687784 | 0.951 |
| 0.04542096834871745 | 0.795 |
| 0.2864819435883663 | 0.899 |
| 0.030324232732169665 | 0.905 |
| 0.2863208468695465 | 0.461 |
| 0.5107054848759345 | 0.784 |
| 0.12131760137770098 | 0.523 |
| 0.7741837913001477 | 0.967 |
| 0.18688396816050357 | 0.93 |
| 0.01907047531593642 | 0.484 |
| 0.25606509134419575 | 0.678 |
| 0.4333772172869772 | 0.999 |
| 0.05316866808406018 | 0.745 |
| 0.22707607099392857 | 0.636 |
| 0.07498163028313398 | 0.707 |
| 0.18091409977298245 | 0.49 |
| 0.14363983459318364 | 0.815 |
| 0.21278382209904378 | 0.515 |
| 0.20856703412546784 | 0.906 |
| 0.43747933333975 | 0.627 |
| 0.05846384503359481 | 0.365 |
| 0.27994526736954495 | 0.585 |
| 0.027359326177808452 | 0.959 |
| 0.039985548885199895 | 0.715 |
| 0.746048648996435 | 0.874 |
| 0.1779130288650037 | 0.995 |
| 0.15629318722193786 | 0.836 |
| 0.0003653642136921542 | 0.369 |
| 0.3404394753460611 | 0.453 |
| 0.23274515018249242 | 0.999 |
| 0.09115339770278508 | 0.774 |
| 0.034961686733942066 | 0.477 |
| 0.22927364643314607 | 0.794 |
| 0.3918425702872539 | 0.89 |
| 0.07801370683018016 | 0.752 |
| 0.166963062632292 | 0.649 |
| 0.20730315778373154 | 0.999 |
| 0.6024992828866094 | 0.981 |
| 0.07566405930651832 | 0.871 |
| 0.04124734209062486 | 0.65 |
| 0.0672422382125043 | 0.836 |
| 0.3798232609331713 | 0.901 |
| 0.23980344436021306 | 0.971 |
| 0.316012852491093 | 0.752 |
| 0.33994478848099197 | 0.696 |
| 0.7952972592819764 | 0.944 |
| 0.4934776208352165 | 1 |
| 0.15443650919405816 | 0.568 |
| 0.1680616563333711 | 0.472 |
| 0.19327830626198994 | 0.855 |
| 0.5635088355082344 | 0.876 |
| 0.058797901513201856 | 0.879 |
| 0.028493530277887924 | 0.893 |
| 0.09691796970811595 | 0.545 |
| 0.37560294836203345 | 0.917 |
| 0.015534500823058961 | 0.319 |
| 0.030152475259434652 | 0.759 |
| 0.18033082361612818 | 0.439 |
| 0.5875822010996821 | 0.661 |
| 0.1935414827689913 | 0.985 |
| 0.44554473124917593 | 0.957 |
| 0.21712979166239676 | 0.773 |
| 0.054491946541637803 | 0.751 |
| 0.1374595497995258 | 0.526 |
| 0.08758825550061011 | 0.667 |
| 0.14364028475013046 | 0.312 |
| 0.1291982173978642 | 0.964 |
| 0.09358553135202685 | 0.969 |
| 0.029086076435260844 | 0.701 |
| 0.03646192638261592 | 0.418 |
| 0.11503361530176537 | 0.621 |
| 0.16433490394001726 | 0.913 |
| 0.014371745854916962 | 0.655 |
| 0.21948230885637743 | 0.954 |
| 0.21220254220837043 | 0.978 |
| 0.0063362064107428395 | 0.691 |
| 0.24902958751319815 | 0.587 |
| 0.2652674748080195 | 0.592 |
| 0.008693616459411913 | 0.482 |
| 0.20398121434285243 | 0.808 |
| 0.3590462030880279 | 0.896 |
| 0.013422351734343363 | 0.555 |
| 0.02418749470760273 | 0.544 |
| 0.20221939698377078 | 0.829 |
| 0.4467491011955892 | 0.998 |
| 0.2695725957602666 | 0.755 |
| 0.5410981571589568 | 0.832 |
| 0.37249519133486375 | 0.957 |
| 0.19298641983075715 | 0.599 |
| 0.24660885917785846 | 0.819 |
| 0.5144571248050083 | 0.785 |
| 0.4425296365893244 | 0.847 |
| 0.03762330906701483 | 0.943 |
| 0.33400826400347094 | 0.938 |
| 0.6121477732175584 | 0.863 |
| 0.02903049738735808 | 0.528 |
| 0.7200495573978976 | 0.87 |
| 0.24107544697616679 | 0.832 |
| 0.27703714749527664 | 0.664 |
| 0.3949905195872293 | 0.823 |
| 0.23254426791184846 | 0.884 |
| 0.43528739030873365 | 0.467 |
| 0.04168931552136279 | 0.838 |
| 0.10916771782003509 | 0.645 |
| 0.02964535025673276 | 0.887 |
| 0.005977261593887118 | 0.78 |
| 0.0468442213579664 | 0.77 |
| 0.44157253993398726 | 0.652 |
| 0.12464748836835271 | 0.925 |
| 0.05348842685859967 | 0.38 |
| 0.4887225705147218 | 0.84 |
| 0.10717973111664747 | 0.657 |
| 0.08847958291100222 | 0.982 |
| 0.5436023446141725 | 0.97 |
| 0.7867456271224823 | 0.938 |
| 0.1712303211283519 | 0.733 |
| 0.11312090914806672 | 0.78 |
| 0.012180607648268782 | 0.801 |
| 0.48170515097500166 | 0.994 |
| 0.16364904442061368 | 0.796 |
| 0.29231884517912166 | 0.885 |
| 0.06867705598078222 | 0.322 |
| 0.03331253535933454 | 0.585 |
| 0.444257301676393 | 0.526 |
| 0.07673884115592666 | 0.939 |
| 0.08244067154603552 | 0.989 |
| 0.14985987191572336 | 0.921 |
| 0.43611181635043217 | 0.776 |
| 0.538286371110787 | 0.732 |
| 0.4816052496633896 | 0.621 |
| 0.19889175155166672 | 0.416 |
| 0.22006560393538988 | 0.509 |
| 0.3219975887090325 | 0.99 |
| 0.026653236495087884 | 0.819 |
| 0.03452509978333784 | 0.426 |
| 0.4507130800521155 | 0.835 |
| 0.3871936036062893 | 0.798 |
| 0.4533043090301585 | 0.559 |
| 0.13933706913276622 | 0.659 |
| 0.15848231179935457 | 0.966 |
| 0.019090354066876647 | 0.842 |
| 0.21961142208235873 | 0.96 |
| 0.1454392195801607 | 0.809 |
| 0.437472833130761 | 0.741 |
| 0.1773558822291026 | 0.971 |
| 0.061735727808236884 | 0.978 |
| 0.18384890581802305 | 0.736 |
| 0.029728739752080346 | 0.91 |
| 0.10235315778967136 | 0.984 |
| 0.05945629888319037 | 0.802 |
| 0.4676602441688663 | 0.73 |
| 0.00011067834341993432 | 0.435 |
| 0.026877474408502966 | 0.765 |
| 0.11713345623658622 | 0.928 |
| 0.42568044912931147 | 0.943 |
| 0.38579813443634636 | 0.855 |
| 0.12104295816671962 | 0.788 |
| 0.7815657482589033 | 0.899 |
| 0.3291553215509132 | 0.69 |
| 0.28370334465193625 | 0.873 |
| 0.16704342662214966 | 0.906 |
| 0.060912663517255106 | 0.174 |
| 0.2582850355088845 | 0.984 |
| 0.38754976177029477 | 0.473 |
| 0.16799121925827865 | 0.465 |
| 0.14059276472826976 | 0.631 |
| 0.6682937553183802 | 0.919 |
| 0.23552402066850942 | 0.928 |
| 0.1787889429214219 | 0.354 |
| 0.024304625440159877 | 0.886 |
| 0.3901578792625303 | 0.773 |
| 0.2707824640527988 | 0.908 |
| 0.26830692187263416 | 0.676 |
| 0.26882885208326834 | 0.699 |
| 0.00168808657957642 | 0.83 |
| 0.14185239691827 | 0.204 |
| 0.6341598991653734 | 0.732 |
| 0.02006223284886266 | 0.596 |
| 0.19244940140896227 | 0.837 |
| 0.010307292741369989 | 0.469 |
| 0.2511924775445008 | 0.883 |
| 0.10054291080112643 | 0.577 |
| 0.5389553388282389 | 0.905 |
| 0.454934465855778 | 0.713 |
| 0.20200179221884995 | 0.429 |
| 0.30893105631163553 | 0.891 |
| 0.43399772470603126 | 0.687 |
| 0.7803854227085332 | 0.947 |
| 0.33130630663905836 | 0.967 |
| 0.23498811095921524 | 0.803 |
| 0.03350338343255532 | 0.868 |
| 0.5150675679326161 | 0.743 |
| 0.14395075833537152 | 0.887 |
| 0.5325102619125692 | 0.941 |
| 0.2780126039014661 | 0.786 |
| 0.3071831989227275 | 0.933 |
| 0.18005526360142676 | 0.893 |
| 0.2962501269377812 | 0.818 |
| 0.04957971130243466 | 0.998 |
| 0.56031057375579 | 0.919 |